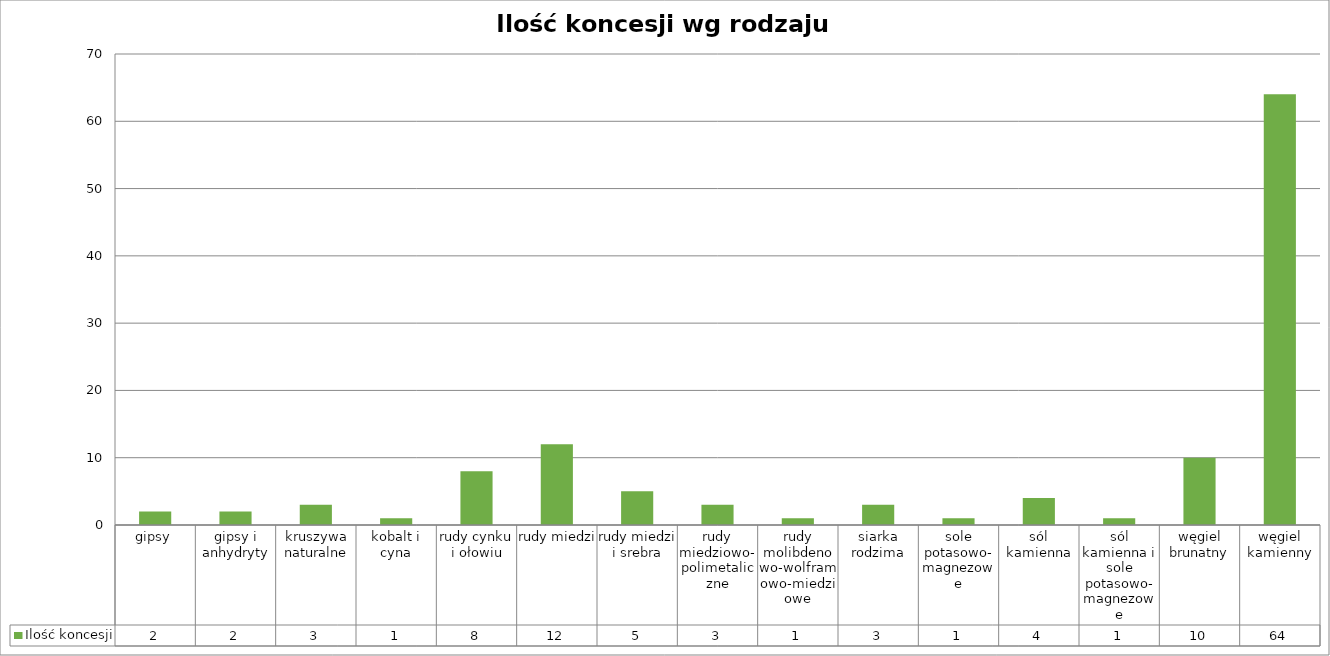
| Category | Ilość koncesji |
|---|---|
| gipsy | 2 |
| gipsy i anhydryty | 2 |
| kruszywa naturalne | 3 |
| kobalt i cyna | 1 |
| rudy cynku i ołowiu | 8 |
| rudy miedzi | 12 |
| rudy miedzi i srebra | 5 |
| rudy miedziowo-polimetaliczne | 3 |
| rudy molibdenowo-wolframowo-miedziowe | 1 |
| siarka rodzima | 3 |
| sole potasowo-magnezowe | 1 |
| sól kamienna | 4 |
| sól kamienna i sole potasowo-magnezowe | 1 |
| węgiel brunatny | 10 |
| węgiel kamienny | 64 |